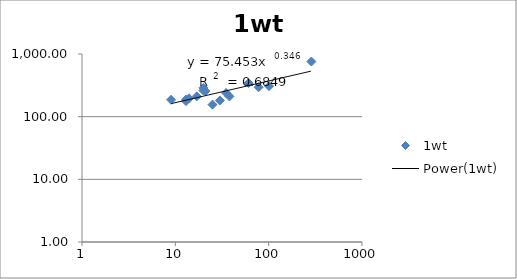
| Category | 1wt |
|---|---|
| 287.0 | 757.1 |
| 101.0 | 307.13 |
| 78.0 | 294.99 |
| 61.0 | 343.59 |
| 38.0 | 210.7 |
| 35.0 | 239.07 |
| 30.0 | 181.09 |
| 25.0 | 155.6 |
| 21.0 | 256.02 |
| 20.0 | 261.21 |
| 20.0 | 288.06 |
| 17.0 | 210.84 |
| 14.0 | 195.67 |
| 13.0 | 187.34 |
| 13.0 | 177.27 |
| 9.0 | 185.97 |